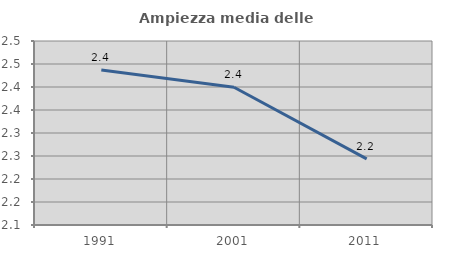
| Category | Ampiezza media delle famiglie |
|---|---|
| 1991.0 | 2.437 |
| 2001.0 | 2.399 |
| 2011.0 | 2.244 |